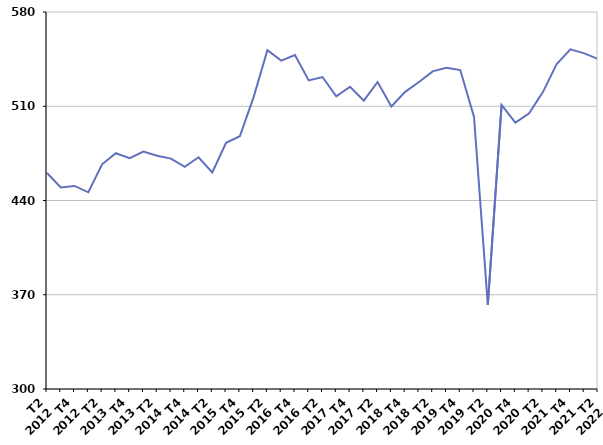
| Category | Ensemble des sorties de catégories A, B, C |
|---|---|
| T2
2012 | 460.4 |
| T3
2012 | 449.7 |
| T4
2012 | 450.8 |
| T1
2013 | 446.1 |
| T2
2013 | 466.9 |
| T3
2013 | 475.1 |
| T4
2013 | 471.4 |
| T1
2014 | 476.4 |
| T2
2014 | 473.2 |
| T3
2014 | 471.1 |
| T4
2014 | 465 |
| T1
2015 | 472.1 |
| T2
2015 | 460.9 |
| T3
2015 | 482.9 |
| T4
2015 | 487.7 |
| T1
2016 | 516.8 |
| T2
2016 | 551.6 |
| T3
2016 | 543.9 |
| T4
2016 | 548 |
| T1
2017 | 529.2 |
| T2
2017 | 531.7 |
| T3
2017 | 517.3 |
| T4
2017 | 524.5 |
| T1
2018 | 514.2 |
| T2
2018 | 528 |
| T3
2018 | 509.8 |
| T4
2018 | 520.7 |
| T1
2019 | 528 |
| T2
2019 | 535.9 |
| T3
2019 | 538.5 |
| T4
2019 | 536.9 |
| T1
2020 | 502.1 |
| T2
2020 | 362.5 |
| T3
2020 | 511 |
| T4
2020 | 497.9 |
| T1
2021 | 504.7 |
| T2
2021 | 520.5 |
| T3
2021 | 541.4 |
| T4
2021 | 552.3 |
| T1
2022 | 549.3 |
| T2
2022 | 545.2 |